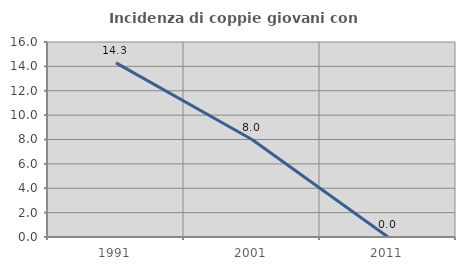
| Category | Incidenza di coppie giovani con figli |
|---|---|
| 1991.0 | 14.286 |
| 2001.0 | 8 |
| 2011.0 | 0 |